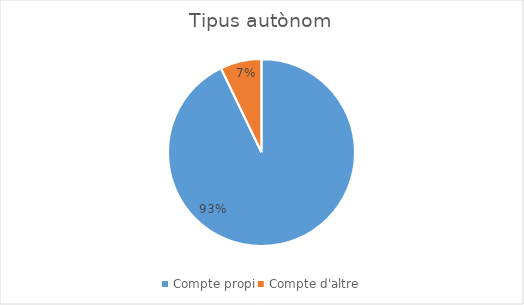
| Category | Series 0 |
|---|---|
| Compte propi | 13 |
| Compte d'altre | 1 |